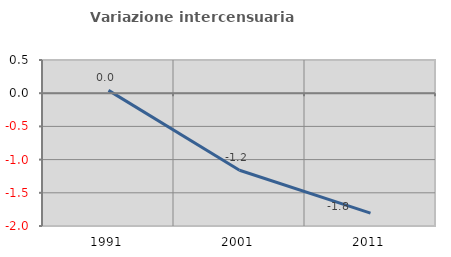
| Category | Variazione intercensuaria annua |
|---|---|
| 1991.0 | 0.042 |
| 2001.0 | -1.16 |
| 2011.0 | -1.807 |